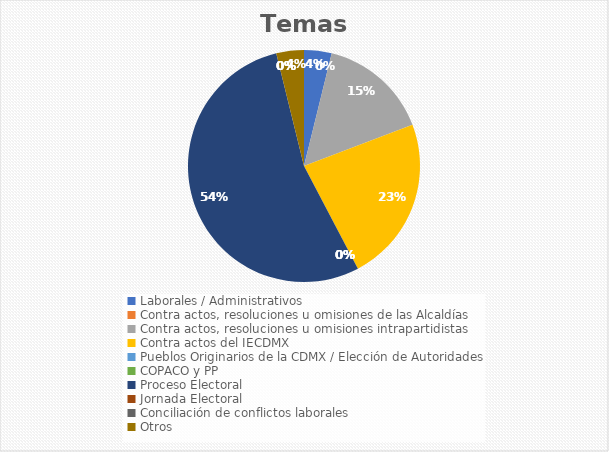
| Category | Temas |
|---|---|
| Laborales / Administrativos | 1 |
| Contra actos, resoluciones u omisiones de las Alcaldías | 0 |
| Contra actos, resoluciones u omisiones intrapartidistas | 4 |
| Contra actos del IECDMX | 6 |
| Pueblos Originarios de la CDMX / Elección de Autoridades | 0 |
| COPACO y PP | 0 |
| Proceso Electoral | 14 |
| Jornada Electoral | 0 |
| Conciliación de conflictos laborales | 0 |
| Otros | 1 |